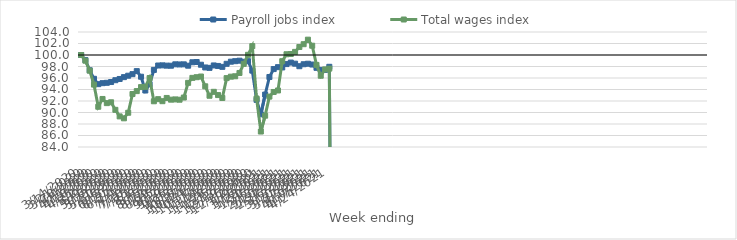
| Category | Payroll jobs index | Total wages index |
|---|---|---|
| 14/03/2020 | 100 | 100 |
| 21/03/2020 | 99.113 | 99.01 |
| 28/03/2020 | 97.346 | 97.275 |
| 04/04/2020 | 95.862 | 94.852 |
| 11/04/2020 | 94.928 | 91.002 |
| 18/04/2020 | 95.102 | 92.353 |
| 25/04/2020 | 95.165 | 91.63 |
| 02/05/2020 | 95.3 | 91.776 |
| 09/05/2020 | 95.616 | 90.461 |
| 16/05/2020 | 95.83 | 89.321 |
| 23/05/2020 | 96.151 | 88.988 |
| 30/05/2020 | 96.399 | 89.956 |
| 06/06/2020 | 96.67 | 93.214 |
| 13/06/2020 | 97.195 | 93.72 |
| 20/06/2020 | 96.22 | 94.418 |
| 27/06/2020 | 93.825 | 94.465 |
| 04/07/2020 | 94.918 | 95.993 |
| 11/07/2020 | 97.404 | 91.952 |
| 18/07/2020 | 98.174 | 92.318 |
| 25/07/2020 | 98.2 | 91.97 |
| 01/08/2020 | 98.148 | 92.531 |
| 08/08/2020 | 98.136 | 92.233 |
| 15/08/2020 | 98.38 | 92.276 |
| 22/08/2020 | 98.358 | 92.225 |
| 29/08/2020 | 98.375 | 92.601 |
| 05/09/2020 | 98.14 | 95.156 |
| 12/09/2020 | 98.738 | 96.022 |
| 19/09/2020 | 98.781 | 96.14 |
| 26/09/2020 | 98.307 | 96.256 |
| 03/10/2020 | 97.833 | 94.552 |
| 10/10/2020 | 97.764 | 92.915 |
| 17/10/2020 | 98.185 | 93.596 |
| 24/10/2020 | 98.098 | 93.032 |
| 31/10/2020 | 97.939 | 92.526 |
| 07/11/2020 | 98.469 | 95.978 |
| 14/11/2020 | 98.837 | 96.232 |
| 21/11/2020 | 98.924 | 96.301 |
| 28/11/2020 | 99.008 | 96.876 |
| 05/12/2020 | 98.819 | 98.458 |
| 12/12/2020 | 98.925 | 100.032 |
| 19/12/2020 | 97.278 | 101.54 |
| 26/12/2020 | 92.202 | 92.438 |
| 02/01/2021 | 89.68 | 86.689 |
| 09/01/2021 | 93.118 | 89.445 |
| 16/01/2021 | 96.174 | 92.769 |
| 23/01/2021 | 97.554 | 93.568 |
| 30/01/2021 | 97.884 | 93.831 |
| 06/02/2021 | 97.834 | 98.925 |
| 13/02/2021 | 98.421 | 100.131 |
| 20/02/2021 | 98.684 | 100.17 |
| 27/02/2021 | 98.49 | 100.545 |
| 06/03/2021 | 98.051 | 101.395 |
| 13/03/2021 | 98.393 | 101.88 |
| 20/03/2021 | 98.483 | 102.666 |
| 27/03/2021 | 98.341 | 101.612 |
| 03/04/2021 | 97.77 | 98.275 |
| 10/04/2021 | 97.404 | 96.393 |
| 17/04/2021 | 97.409 | 97.49 |
| 24/04/2021 | 97.948 | 97.631 |